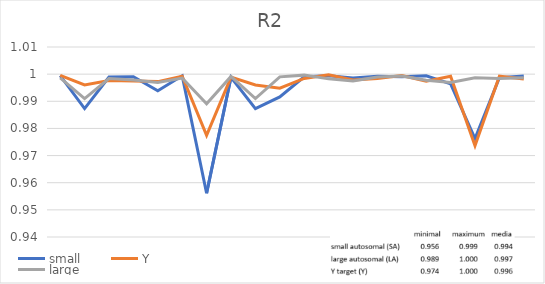
| Category | small | Y | large |
|---|---|---|---|
| 0 | 0.999 | 1 | 0.999 |
| 1 | 0.987 | 0.996 | 0.991 |
| 2 | 0.999 | 0.998 | 0.998 |
| 3 | 0.999 | 0.997 | 0.998 |
| 4 | 0.994 | 0.997 | 0.997 |
| 5 | 0.999 | 0.999 | 0.999 |
| 6 | 0.956 | 0.977 | 0.989 |
| 7 | 0.999 | 0.999 | 0.999 |
| 8 | 0.987 | 0.996 | 0.991 |
| 9 | 0.992 | 0.995 | 0.999 |
| 10 | 0.999 | 0.998 | 1 |
| 11 | 0.999 | 1 | 0.998 |
| 12 | 0.999 | 0.998 | 0.997 |
| 13 | 0.999 | 0.998 | 0.999 |
| 14 | 0.999 | 0.999 | 0.999 |
| 15 | 0.999 | 0.997 | 0.998 |
| 16 | 0.996 | 0.999 | 0.997 |
| 17 | 0.976 | 0.974 | 0.999 |
| 18 | 0.999 | 0.999 | 0.998 |
| 19 | 0.999 | 0.998 | 0.999 |